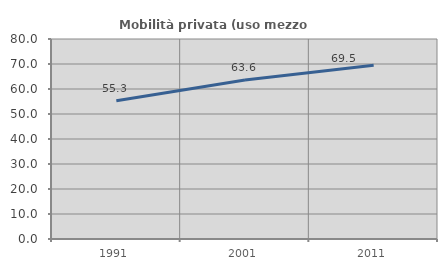
| Category | Mobilità privata (uso mezzo privato) |
|---|---|
| 1991.0 | 55.283 |
| 2001.0 | 63.578 |
| 2011.0 | 69.492 |